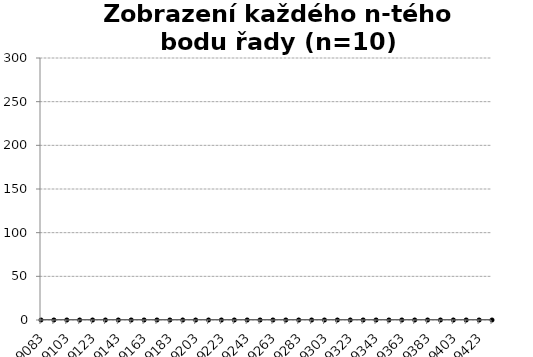
| Category | Series 1 |
|---|---|
| 2007-01-01 | 0 |
| 2007-01-11 | 53 |
| 2007-01-21 | 48 |
| 2007-01-31 | 90 |
| 2007-02-10 | 116 |
| 2007-02-20 | 101 |
| 2007-03-02 | 86 |
| 2007-03-12 | 74 |
| 2007-03-22 | 67 |
| 2007-04-01 | 64 |
| 2007-04-11 | 60 |
| 2007-04-21 | 56 |
| 2007-05-01 | 117 |
| 2007-05-11 | 105 |
| 2007-05-21 | 123 |
| 2007-05-31 | 140 |
| 2007-06-10 | 128 |
| 2007-06-20 | 164 |
| 2007-06-30 | 155 |
| 2007-07-10 | 185 |
| 2007-07-20 | 164 |
| 2007-07-30 | 137 |
| 2007-08-09 | 165 |
| 2007-08-19 | 186 |
| 2007-08-29 | 182 |
| 2007-09-08 | 212 |
| 2007-09-18 | 230 |
| 2007-09-28 | 244 |
| 2007-10-08 | 270 |
| 2007-10-18 | 218 |
| 2007-10-28 | 180 |
| 2007-11-07 | 160 |
| 2007-11-17 | 103 |
| 2007-11-27 | 105 |
| 2007-12-07 | 109 |
| 2007-12-17 | 121 |